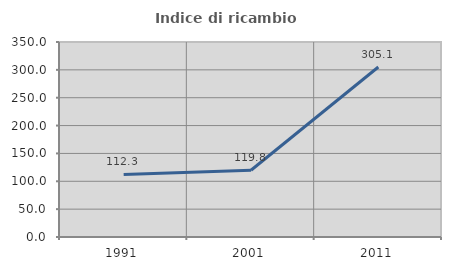
| Category | Indice di ricambio occupazionale  |
|---|---|
| 1991.0 | 112.308 |
| 2001.0 | 119.797 |
| 2011.0 | 305.128 |